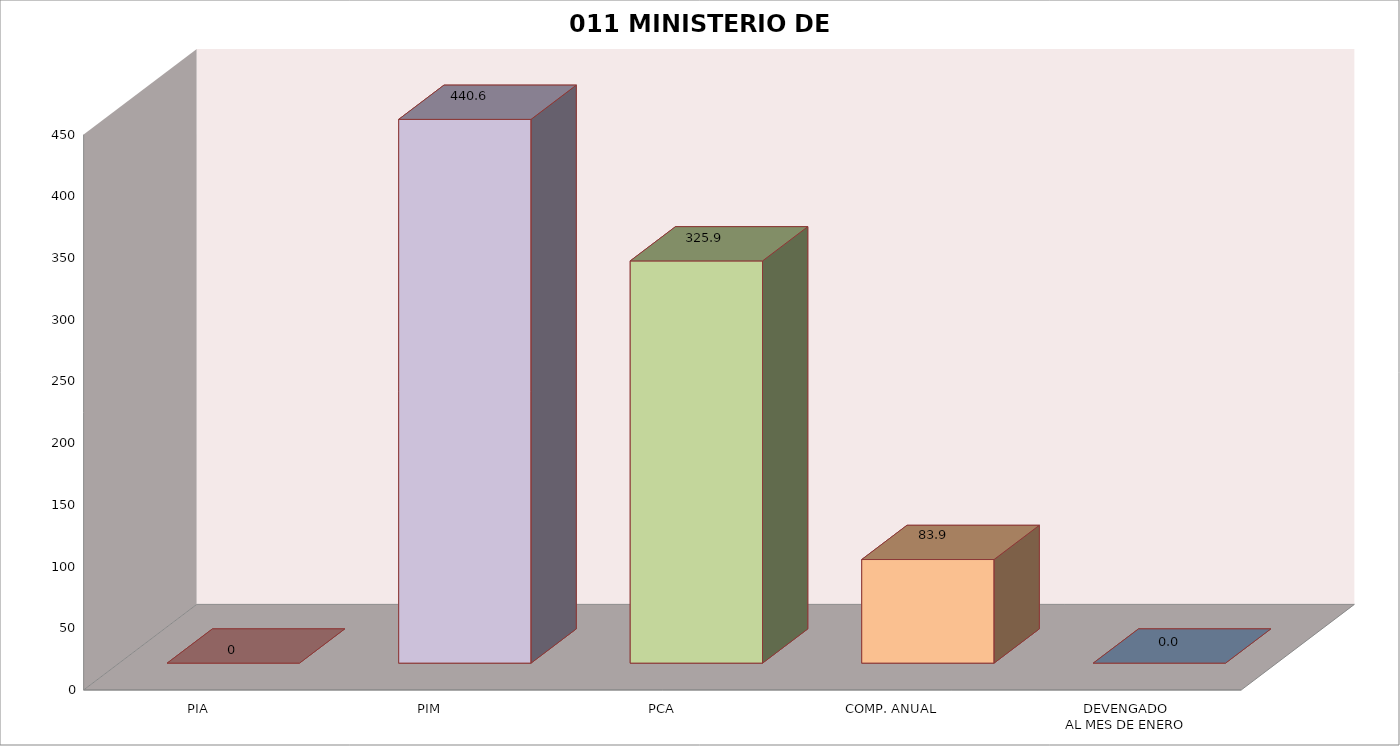
| Category | 011 MINISTERIO DE SALUD |
|---|---|
| PIA | 0 |
| PIM | 440.571 |
| PCA | 325.884 |
| COMP. ANUAL | 83.939 |
| DEVENGADO
AL MES DE ENERO | 0 |